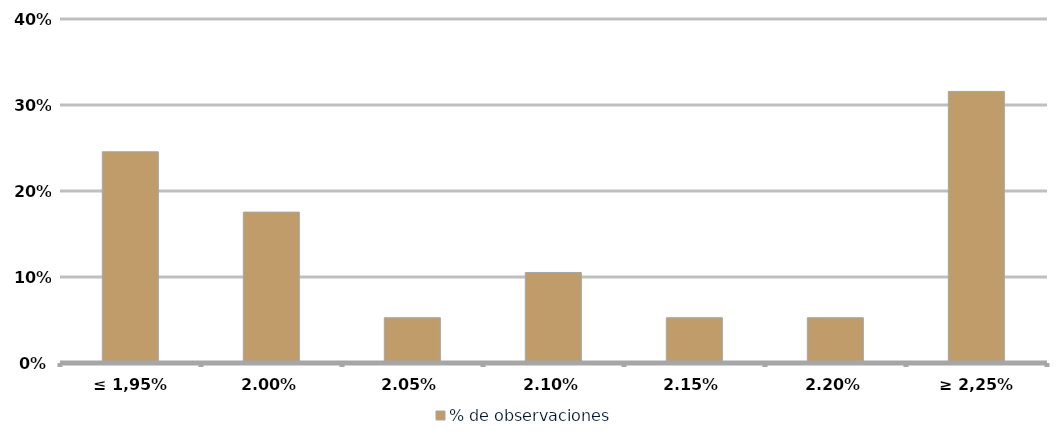
| Category | % de observaciones  |
|---|---|
| ≤ 1,95% | 0.246 |
| 2,00% | 0.175 |
| 2,05% | 0.053 |
| 2,10% | 0.105 |
| 2,15% | 0.053 |
| 2,20% | 0.053 |
| ≥ 2,25% | 0.316 |